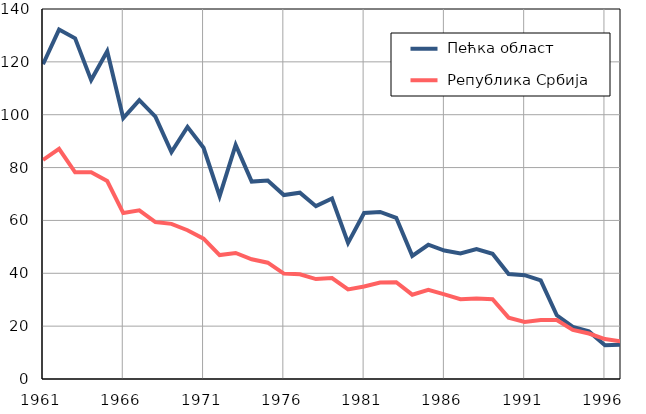
| Category |  Пећка област |  Република Србија |
|---|---|---|
| 1961.0 | 119.1 | 82.9 |
| 1962.0 | 132.2 | 87.1 |
| 1963.0 | 128.9 | 78.2 |
| 1964.0 | 113.1 | 78.2 |
| 1965.0 | 124 | 74.9 |
| 1966.0 | 98.7 | 62.8 |
| 1967.0 | 105.5 | 63.8 |
| 1968.0 | 99.3 | 59.4 |
| 1969.0 | 85.9 | 58.7 |
| 1970.0 | 95.4 | 56.3 |
| 1971.0 | 87.5 | 53.1 |
| 1972.0 | 69.2 | 46.9 |
| 1973.0 | 88.6 | 47.7 |
| 1974.0 | 74.7 | 45.3 |
| 1975.0 | 75.1 | 44 |
| 1976.0 | 69.6 | 39.9 |
| 1977.0 | 70.5 | 39.6 |
| 1978.0 | 65.4 | 37.8 |
| 1979.0 | 68.3 | 38.2 |
| 1980.0 | 51.5 | 33.9 |
| 1981.0 | 62.8 | 35 |
| 1982.0 | 63.2 | 36.5 |
| 1983.0 | 61 | 36.6 |
| 1984.0 | 46.6 | 31.9 |
| 1985.0 | 50.8 | 33.7 |
| 1986.0 | 48.6 | 32 |
| 1987.0 | 47.5 | 30.2 |
| 1988.0 | 49.2 | 30.5 |
| 1989.0 | 47.4 | 30.2 |
| 1990.0 | 39.7 | 23.2 |
| 1991.0 | 39.3 | 21.6 |
| 1992.0 | 37.3 | 22.3 |
| 1993.0 | 24.1 | 22.3 |
| 1994.0 | 19.7 | 18.6 |
| 1995.0 | 18 | 17.2 |
| 1996.0 | 12.8 | 15.1 |
| 1997.0 | 13 | 14.2 |